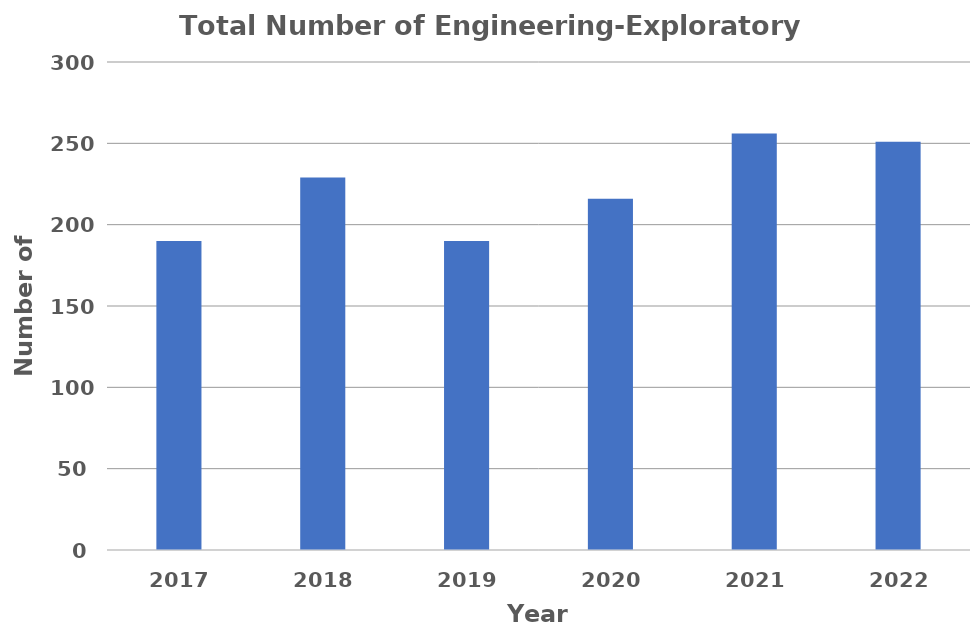
| Category | Total Number of Engineering-Exploratory Students |
|---|---|
| 2017.0 | 190 |
| 2018.0 | 229 |
| 2019.0 | 190 |
| 2020.0 | 216 |
| 2021.0 | 256 |
| 2022.0 | 251 |